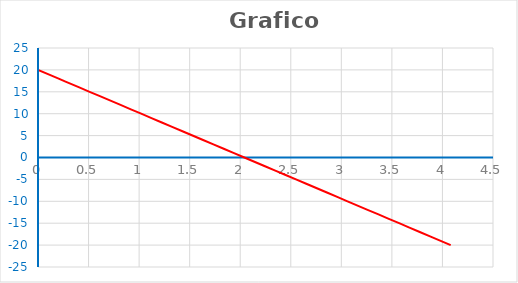
| Category | Series 0 |
|---|---|
| 0.0 | 20 |
| 0.20408163265306123 | 18 |
| 0.40816326530612246 | 16 |
| 0.6122448979591837 | 14 |
| 0.8163265306122449 | 12 |
| 1.0204081632653061 | 10 |
| 1.2244897959183674 | 8 |
| 1.4285714285714286 | 6 |
| 1.6326530612244898 | 4 |
| 1.836734693877551 | 2 |
| 2.0408163265306123 | 0 |
| 2.2448979591836737 | -2 |
| 2.4489795918367347 | -4 |
| 2.6530612244897958 | -6 |
| 2.8571428571428568 | -8 |
| 3.0612244897959178 | -10 |
| 3.2653061224489788 | -12 |
| 3.46938775510204 | -14 |
| 3.673469387755101 | -16 |
| 3.877551020408162 | -18 |
| 4.081632653061223 | -20 |